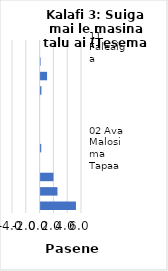
| Category | All items - m-m changes |
|---|---|
| 11 Faleaiga | 0 |
| 03 Lavalava ma Seevae | -0.037 |
| 05 Meafale, Mea Faigaleuga mo Faaleleia o Aiga | 0.936 |
| 12 Isi Oloa ma Auaunaga | 0.121 |
| 09 Faafiafiaga ma Aganuu | 0 |
| 10 Aoaoga | 0 |
| 06 Soifua Maloloina | 0 |
| 02 Ava Malosi ma Tapaa | 0.092 |
| 08 Fesootaiga | 0 |
| 04 Fale, Suavai, Eletise, Kesi ma isi | 1.864 |
| 01 Meaai ma Vaiinu | 2.446 |
| 07 Femalagaiga | 5.124 |